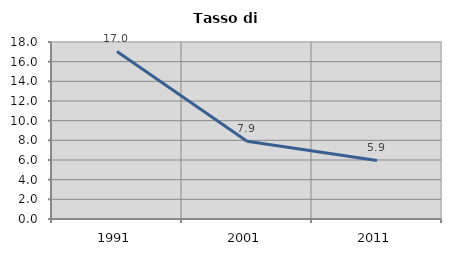
| Category | Tasso di disoccupazione   |
|---|---|
| 1991.0 | 17.037 |
| 2001.0 | 7.91 |
| 2011.0 | 5.95 |